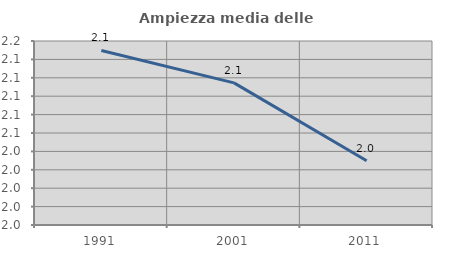
| Category | Ampiezza media delle famiglie |
|---|---|
| 1991.0 | 2.14 |
| 2001.0 | 2.104 |
| 2011.0 | 2.02 |